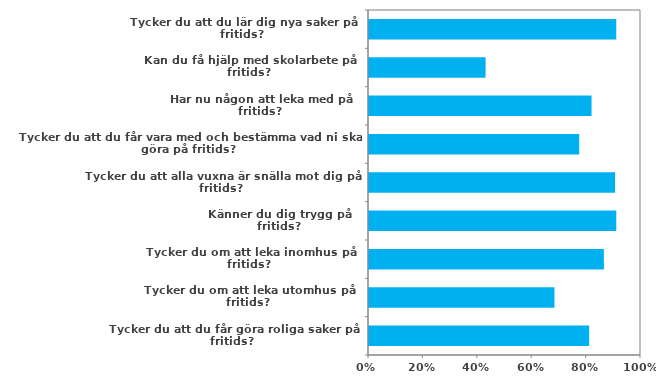
| Category | (Alla) |
|---|---|
| Tycker du att du lär dig nya saker på fritids? | 0.909 |
| Kan du få hjälp med skolarbete på fritids? | 0.429 |
| Har nu någon att leka med på fritids? | 0.818 |
| Tycker du att du får vara med och bestämma vad ni ska göra på fritids? | 0.773 |
| Tycker du att alla vuxna är snälla mot dig på fritids? | 0.905 |
| Känner du dig trygg på fritids? | 0.909 |
| Tycker du om att leka inomhus på fritids? | 0.864 |
| Tycker du om att leka utomhus på fritids? | 0.682 |
| Tycker du att du får göra roliga saker på fritids? | 0.81 |